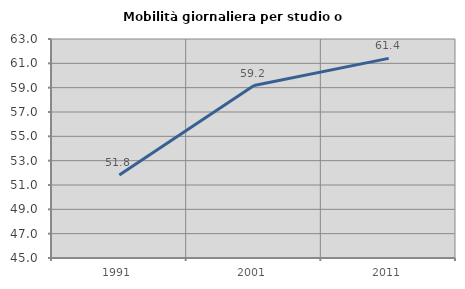
| Category | Mobilità giornaliera per studio o lavoro |
|---|---|
| 1991.0 | 51.825 |
| 2001.0 | 59.174 |
| 2011.0 | 61.409 |